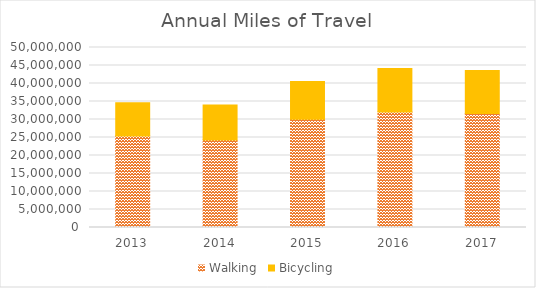
| Category | Walking | Bicycling |
|---|---|---|
| 2013 | 25419004.992 | 9209172.952 |
| 2014 | 24288413.365 | 9727291.751 |
| 2015 | 30068993.887 | 10458667.962 |
| 2016 | 32056793.26 | 12129729.577 |
| 2017 | 31657216.173 | 11924676.495 |